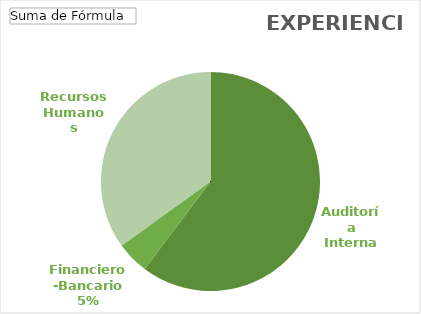
| Category | Total |
|---|---|
| Auditoría Interna | 364 |
| Financiero-Bancario | 29 |
| Recursos Humanos | 211 |